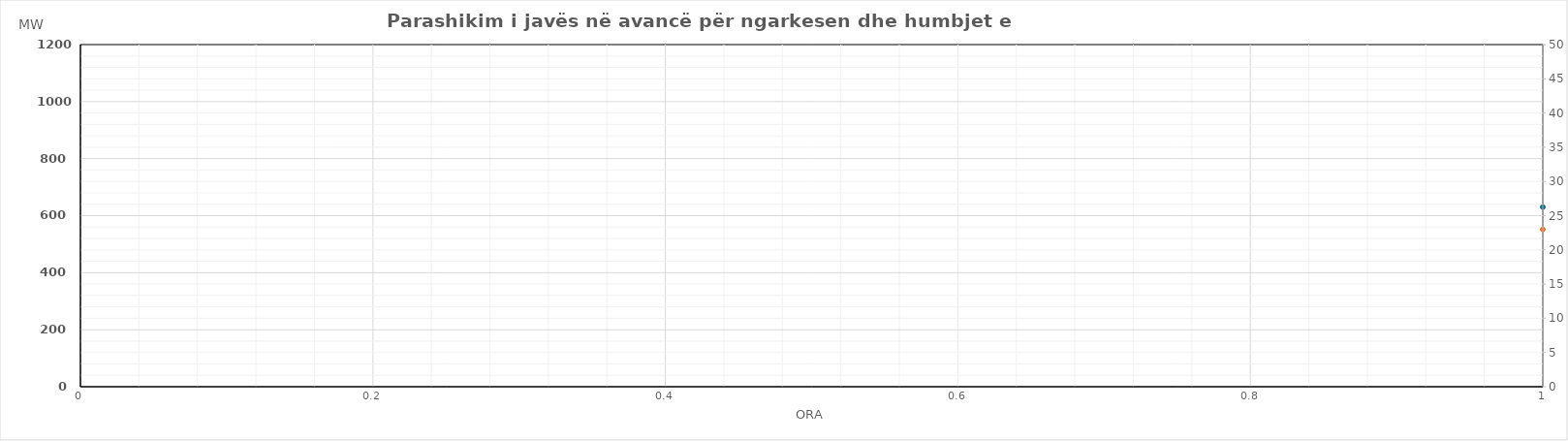
| Category | Ngarkesa (MWh) |
|---|---|
| 0 | 551.46 |
| 1 | 520.64 |
| 2 | 501.59 |
| 3 | 529.56 |
| 4 | 544.88 |
| 5 | 598.26 |
| 6 | 697.75 |
| 7 | 836.07 |
| 8 | 865.5 |
| 9 | 848.4 |
| 10 | 833.6 |
| 11 | 829.72 |
| 12 | 799.15 |
| 13 | 809.62 |
| 14 | 793.73 |
| 15 | 776.59 |
| 16 | 778.1 |
| 17 | 783.41 |
| 18 | 824.09 |
| 19 | 887.68 |
| 20 | 943.28 |
| 21 | 867.59 |
| 22 | 775.02 |
| 23 | 665 |
| 24 | 555.49 |
| 25 | 514.66 |
| 26 | 490.1 |
| 27 | 519.2 |
| 28 | 534.24 |
| 29 | 578.35 |
| 30 | 679.83 |
| 31 | 819.18 |
| 32 | 848.46 |
| 33 | 829.76 |
| 34 | 814.81 |
| 35 | 812.17 |
| 36 | 807.86 |
| 37 | 755.45 |
| 38 | 753.59 |
| 39 | 724.78 |
| 40 | 710.15 |
| 41 | 744.74 |
| 42 | 803.72 |
| 43 | 860.75 |
| 44 | 931.94 |
| 45 | 876.62 |
| 46 | 764.72 |
| 47 | 938.07 |
| 48 | 539.23 |
| 49 | 493.47 |
| 50 | 469.2 |
| 51 | 463.38 |
| 52 | 503.27 |
| 53 | 542.32 |
| 54 | 625.77 |
| 55 | 743.73 |
| 56 | 817.18 |
| 57 | 823.6 |
| 58 | 815.14 |
| 59 | 798.01 |
| 60 | 781.13 |
| 61 | 767.3 |
| 62 | 754.91 |
| 63 | 742.24 |
| 64 | 711.69 |
| 65 | 736.06 |
| 66 | 770.79 |
| 67 | 838.55 |
| 68 | 879.86 |
| 69 | 818.96 |
| 70 | 730.41 |
| 71 | 632.74 |
| 72 | 524.8 |
| 73 | 470.14 |
| 74 | 449.37 |
| 75 | 438.85 |
| 76 | 491.94 |
| 77 | 535.79 |
| 78 | 634.42 |
| 79 | 790.27 |
| 80 | 874.8 |
| 81 | 888.9 |
| 82 | 886.61 |
| 83 | 883.36 |
| 84 | 873.97 |
| 85 | 820.55 |
| 86 | 810.73 |
| 87 | 786.81 |
| 88 | 742.59 |
| 89 | 814.58 |
| 90 | 803.74 |
| 91 | 861.63 |
| 92 | 888.13 |
| 93 | 825.43 |
| 94 | 720.78 |
| 95 | 597.31 |
| 96 | 570.84 |
| 97 | 512.56 |
| 98 | 483.37 |
| 99 | 478.35 |
| 100 | 519.19 |
| 101 | 570.21 |
| 102 | 673.22 |
| 103 | 823.3 |
| 104 | 892.65 |
| 105 | 902.62 |
| 106 | 893.83 |
| 107 | 810.9 |
| 108 | 762.56 |
| 109 | 757.05 |
| 110 | 761.05 |
| 111 | 761.76 |
| 112 | 721.16 |
| 113 | 740.11 |
| 114 | 790.82 |
| 115 | 845.46 |
| 116 | 915.33 |
| 117 | 850.69 |
| 118 | 747.73 |
| 119 | 613.7 |
| 120 | 608.85 |
| 121 | 555.72 |
| 122 | 527.54 |
| 123 | 516.58 |
| 124 | 531.39 |
| 125 | 558.48 |
| 126 | 648.06 |
| 127 | 748.27 |
| 128 | 823.16 |
| 129 | 843.18 |
| 130 | 832.83 |
| 131 | 817.82 |
| 132 | 810.87 |
| 133 | 820.1 |
| 134 | 861.34 |
| 135 | 809.57 |
| 136 | 774.05 |
| 137 | 792.41 |
| 138 | 837.68 |
| 139 | 902.23 |
| 140 | 970.86 |
| 141 | 906.73 |
| 142 | 797.2 |
| 143 | 684.75 |
| 144 | 653.91 |
| 145 | 598.13 |
| 146 | 563.54 |
| 147 | 560.82 |
| 148 | 559.96 |
| 149 | 567.78 |
| 150 | 628.27 |
| 151 | 721 |
| 152 | 821.69 |
| 153 | 846.6 |
| 154 | 837.65 |
| 155 | 820.16 |
| 156 | 785.76 |
| 157 | 765.12 |
| 158 | 740.2 |
| 159 | 709.87 |
| 160 | 667.03 |
| 161 | 717.42 |
| 162 | 793.84 |
| 163 | 872.23 |
| 164 | 937.79 |
| 165 | 881.76 |
| 166 | 772.62 |
| 167 | 651.96 |